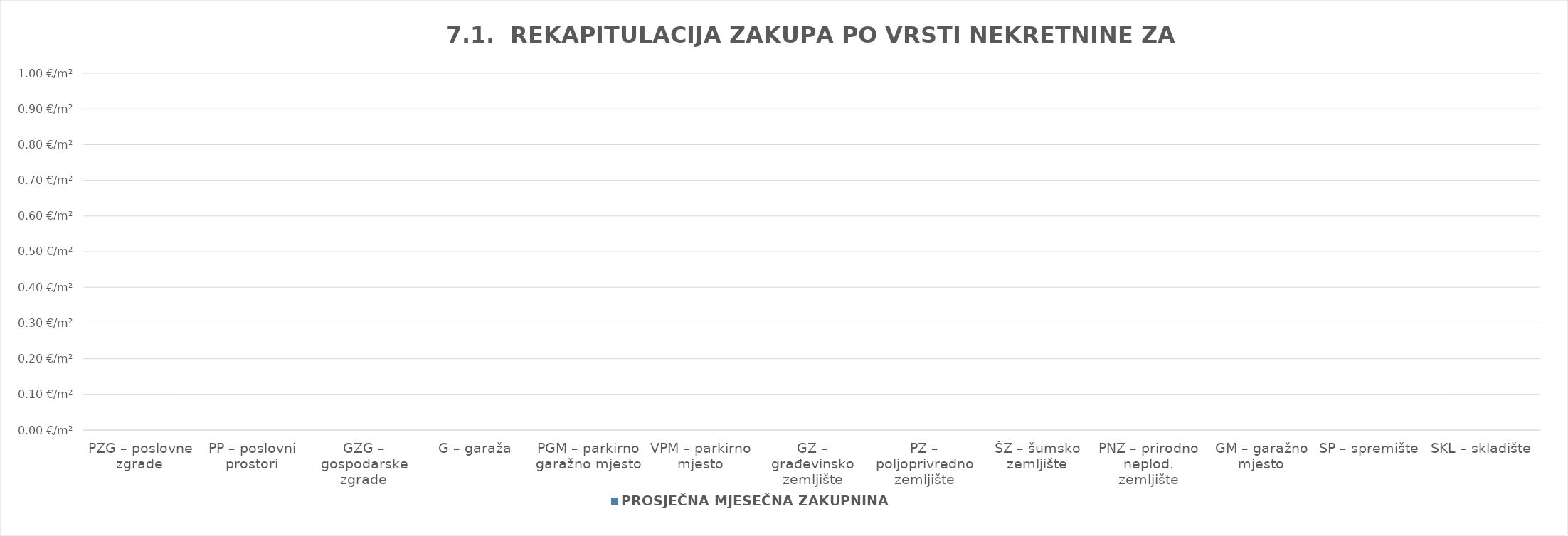
| Category | PROSJEČNA MJESEČNA ZAKUPNINA EUR/m2 |
|---|---|
| PZG – poslovne zgrade | 0 |
| PP – poslovni prostori | 0 |
| GZG – gospodarske zgrade | 0 |
| G – garaža | 0 |
| PGM – parkirno garažno mjesto | 0 |
| VPM – parkirno mjesto | 0 |
| GZ – građevinsko zemljište | 0 |
| PZ – poljoprivredno zemljište | 0 |
| ŠZ – šumsko zemljište | 0 |
| PNZ – prirodno neplod. zemljište | 0 |
| GM – garažno mjesto | 0 |
| SP – spremište  | 0 |
| SKL – skladište  | 0 |